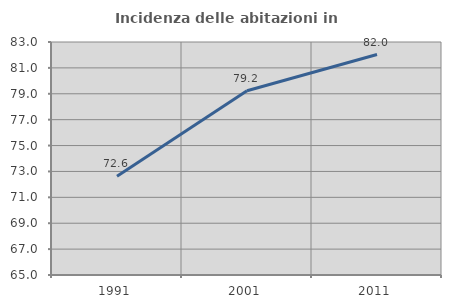
| Category | Incidenza delle abitazioni in proprietà  |
|---|---|
| 1991.0 | 72.638 |
| 2001.0 | 79.234 |
| 2011.0 | 82.032 |